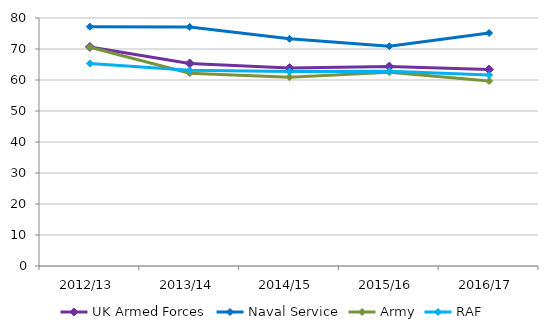
| Category | UK Armed Forces | Naval Service | Army | RAF |
|---|---|---|---|---|
| 2012/13 | 70.664 | 77.196 | 70.549 | 65.335 |
| 2013/14 | 65.34 | 77.124 | 62.189 | 63.141 |
| 2014/15 | 63.833 | 73.289 | 60.923 | 62.704 |
| 2015/16 | 64.352 | 70.896 | 62.519 | 62.843 |
| 2016/17 | 63.39 | 75.173 | 59.663 | 61.611 |